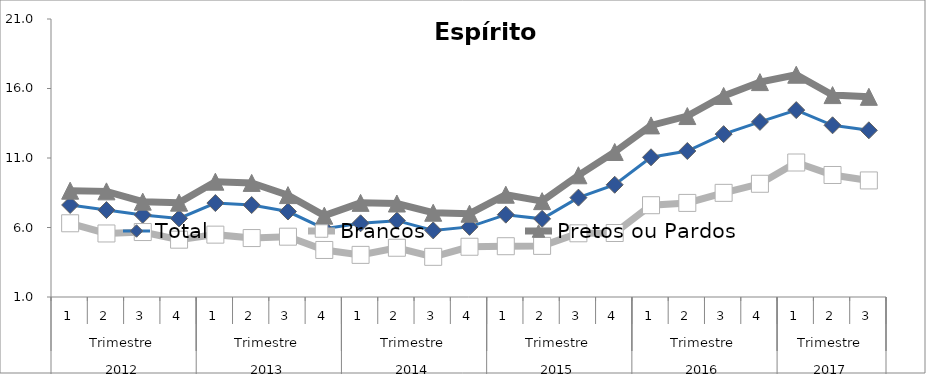
| Category | Total | Brancos | Pretos ou Pardos |
|---|---|---|---|
| 0 | 7.621 | 6.304 | 8.647 |
| 1 | 7.255 | 5.57 | 8.599 |
| 2 | 6.904 | 5.673 | 7.858 |
| 3 | 6.653 | 5.123 | 7.788 |
| 4 | 7.759 | 5.486 | 9.295 |
| 5 | 7.616 | 5.241 | 9.207 |
| 6 | 7.149 | 5.339 | 8.331 |
| 7 | 5.913 | 4.383 | 6.852 |
| 8 | 6.301 | 4.03 | 7.772 |
| 9 | 6.493 | 4.542 | 7.725 |
| 10 | 5.79 | 3.89 | 7.062 |
| 11 | 6.045 | 4.615 | 6.994 |
| 12 | 6.923 | 4.654 | 8.358 |
| 13 | 6.623 | 4.678 | 7.896 |
| 14 | 8.148 | 5.584 | 9.757 |
| 15 | 9.074 | 5.604 | 11.433 |
| 16 | 11.052 | 7.604 | 13.345 |
| 17 | 11.503 | 7.768 | 14.017 |
| 18 | 12.717 | 8.493 | 15.463 |
| 19 | 13.597 | 9.145 | 16.46 |
| 20 | 14.447 | 10.676 | 16.991 |
| 21 | 13.353 | 9.777 | 15.525 |
| 22 | 12.991 | 9.386 | 15.401 |